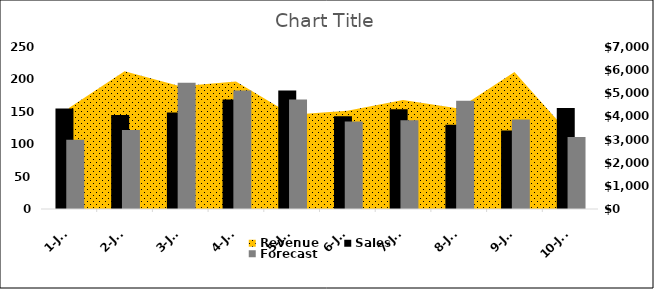
| Category | Sales | Forecast |
|---|---|---|
| 2019-01-01 | 155 | 107 |
| 2019-01-02 | 145 | 122 |
| 2019-01-03 | 149 | 195 |
| 2019-01-04 | 169 | 183 |
| 2019-01-05 | 183 | 169 |
| 2019-01-06 | 143 | 135 |
| 2019-01-07 | 154 | 137 |
| 2019-01-08 | 130 | 167 |
| 2019-01-09 | 121 | 138 |
| 2019-01-10 | 156 | 111 |